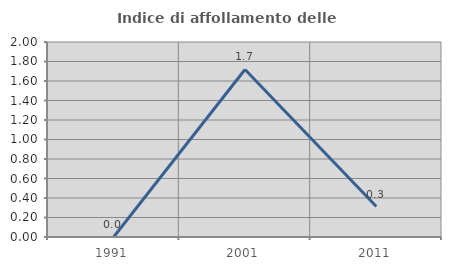
| Category | Indice di affollamento delle abitazioni  |
|---|---|
| 1991.0 | 0 |
| 2001.0 | 1.718 |
| 2011.0 | 0.312 |